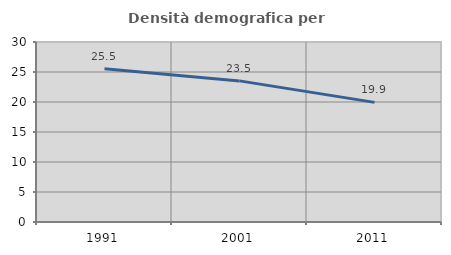
| Category | Densità demografica |
|---|---|
| 1991.0 | 25.528 |
| 2001.0 | 23.519 |
| 2011.0 | 19.938 |